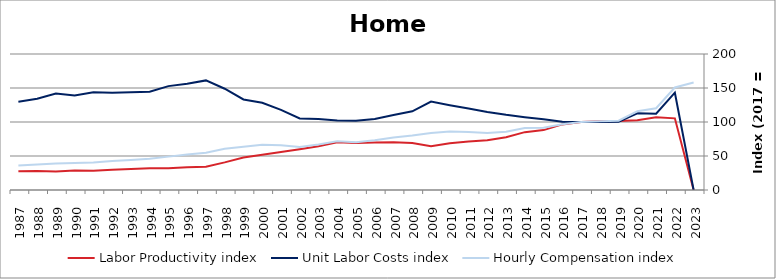
| Category | Labor Productivity index | Unit Labor Costs index | Hourly Compensation index |
|---|---|---|---|
| 2023.0 | 0 | 0 | 158.035 |
| 2022.0 | 105.346 | 143.094 | 150.744 |
| 2021.0 | 107.049 | 112.264 | 120.177 |
| 2020.0 | 102.683 | 112.724 | 115.749 |
| 2019.0 | 101.492 | 100.436 | 101.934 |
| 2018.0 | 101.11 | 99.843 | 100.951 |
| 2017.0 | 100 | 100 | 100 |
| 2016.0 | 96.449 | 100.354 | 96.791 |
| 2015.0 | 88.083 | 104.106 | 91.7 |
| 2014.0 | 85.063 | 107.048 | 91.059 |
| 2013.0 | 77.573 | 110.603 | 85.798 |
| 2012.0 | 73.069 | 114.856 | 83.924 |
| 2011.0 | 71.233 | 119.814 | 85.348 |
| 2010.0 | 68.909 | 124.767 | 85.975 |
| 2009.0 | 64.324 | 130.133 | 83.706 |
| 2008.0 | 69.228 | 115.676 | 80.081 |
| 2007.0 | 70.194 | 110.141 | 77.312 |
| 2006.0 | 69.937 | 104.408 | 73.02 |
| 2005.0 | 69.07 | 101.685 | 70.234 |
| 2004.0 | 70.046 | 102.327 | 71.676 |
| 2003.0 | 64.206 | 104.338 | 66.991 |
| 2002.0 | 60.022 | 105.152 | 63.114 |
| 2001.0 | 55.878 | 117.91 | 65.886 |
| 2000.0 | 51.757 | 128.396 | 66.454 |
| 1999.0 | 47.859 | 133.206 | 63.751 |
| 1998.0 | 40.629 | 148.919 | 60.505 |
| 1997.0 | 34.094 | 161.157 | 54.946 |
| 1996.0 | 33.373 | 156.091 | 52.092 |
| 1995.0 | 32.13 | 152.767 | 49.084 |
| 1994.0 | 31.834 | 144.429 | 45.978 |
| 1993.0 | 30.753 | 143.621 | 44.168 |
| 1992.0 | 29.843 | 143.15 | 42.72 |
| 1991.0 | 28.232 | 143.806 | 40.599 |
| 1990.0 | 28.634 | 139.143 | 39.842 |
| 1989.0 | 27.342 | 141.962 | 38.815 |
| 1988.0 | 27.911 | 134.088 | 37.425 |
| 1987.0 | 27.649 | 129.893 | 35.914 |